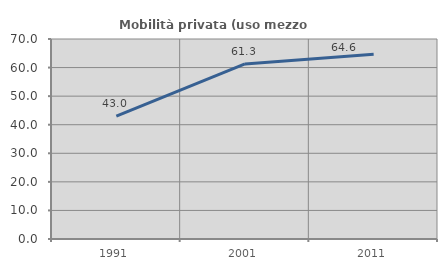
| Category | Mobilità privata (uso mezzo privato) |
|---|---|
| 1991.0 | 43.027 |
| 2001.0 | 61.287 |
| 2011.0 | 64.641 |